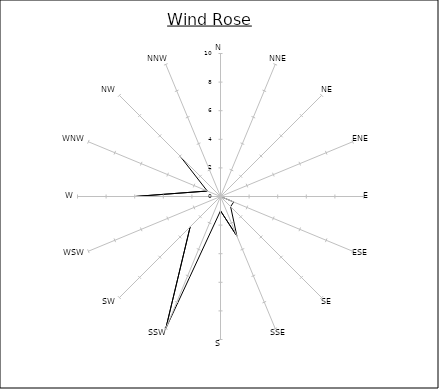
| Category | Series 0 |
|---|---|
| N | 0 |
| NNE | 0 |
| NE | 0 |
| ENE | 0 |
| E | 0 |
| ESE | 1 |
| SE | 1 |
| SSE | 3 |
| S | 1 |
| SSW | 10 |
| SW | 3 |
| WSW | 0 |
| W | 6 |
| WNW | 1 |
| NW | 4 |
| NNW | 0 |